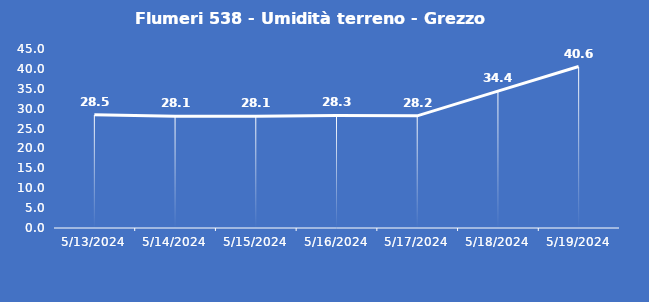
| Category | Flumeri 538 - Umidità terreno - Grezzo (%VWC) |
|---|---|
| 5/13/24 | 28.5 |
| 5/14/24 | 28.1 |
| 5/15/24 | 28.1 |
| 5/16/24 | 28.3 |
| 5/17/24 | 28.2 |
| 5/18/24 | 34.4 |
| 5/19/24 | 40.6 |